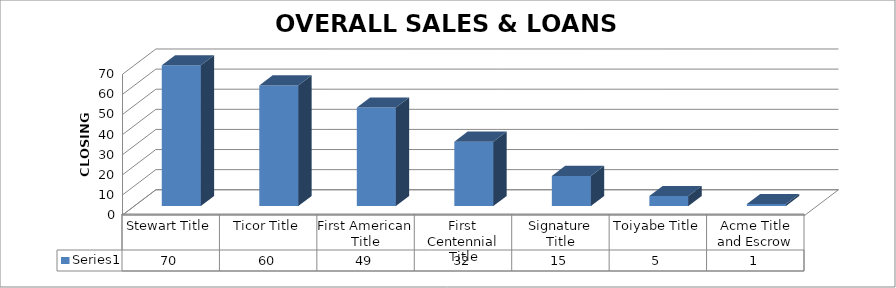
| Category | Series 0 |
|---|---|
| Stewart Title | 70 |
| Ticor Title | 60 |
| First American Title | 49 |
| First Centennial Title | 32 |
| Signature Title | 15 |
| Toiyabe Title | 5 |
| Acme Title and Escrow | 1 |